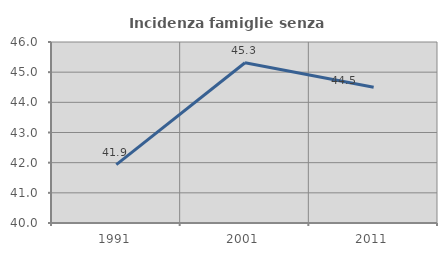
| Category | Incidenza famiglie senza nuclei |
|---|---|
| 1991.0 | 41.935 |
| 2001.0 | 45.312 |
| 2011.0 | 44.503 |